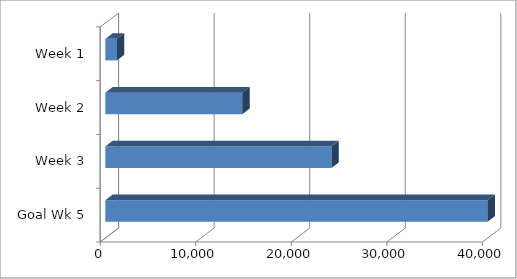
| Category | Series 0 |
|---|---|
| Goal Wk 5 | 40000 |
| Week 3 | 23663 |
| Week 2 | 14332 |
| Week 1 | 1206 |